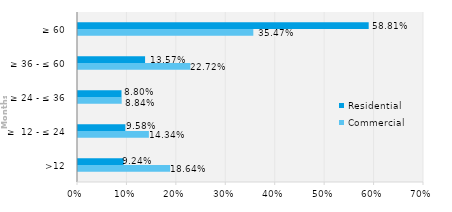
| Category | Commercial | Residential |
|---|---|---|
| >12 | 0.186 | 0.092 |
| ≥  12 - ≤ 24 | 0.143 | 0.096 |
| ≥ 24 - ≤ 36 | 0.088 | 0.088 |
| ≥ 36 - ≤ 60 | 0.227 | 0.136 |
| ≥ 60 | 0.355 | 0.588 |